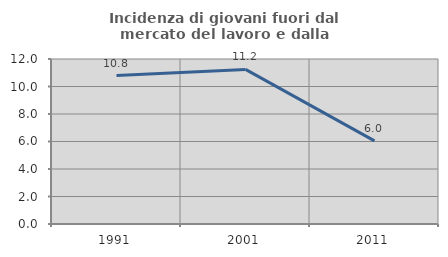
| Category | Incidenza di giovani fuori dal mercato del lavoro e dalla formazione  |
|---|---|
| 1991.0 | 10.798 |
| 2001.0 | 11.243 |
| 2011.0 | 6.044 |